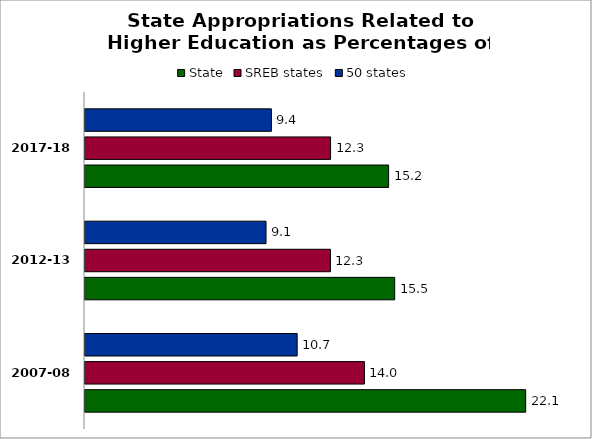
| Category | State | SREB states | 50 states |
|---|---|---|---|
| 2007-08 | 22.122 | 14.028 | 10.651 |
| 2012-13 | 15.547 | 12.322 | 9.087 |
| 2017-18 | 15.243 | 12.328 | 9.358 |